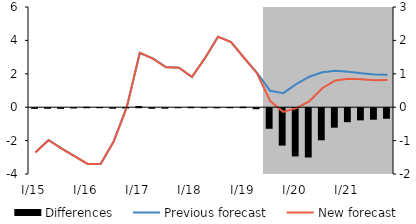
| Category | Differences |
|---|---|
| I/15 | -0.02 |
| II | -0.018 |
| III | -0.02 |
| IV | -0.009 |
| I/16 | 0.012 |
| II | 0.007 |
| III | -0.016 |
| IV | -0.008 |
| I/17 | 0.035 |
| II | -0.018 |
| III | -0.015 |
| IV | -0.001 |
| I/18 | 0.011 |
| II | -0.002 |
| III | -0.003 |
| IV | 0.006 |
| I/19 | 0.016 |
| II | -0.031 |
| III | -0.616 |
| IV | -1.12 |
| I/20 | -1.443 |
| II | -1.476 |
| III | -0.961 |
| IV | -0.584 |
| I/21 | -0.419 |
| II | -0.364 |
| III | -0.345 |
| IV | -0.316 |